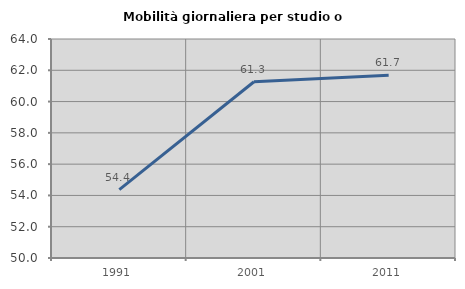
| Category | Mobilità giornaliera per studio o lavoro |
|---|---|
| 1991.0 | 54.373 |
| 2001.0 | 61.269 |
| 2011.0 | 61.677 |